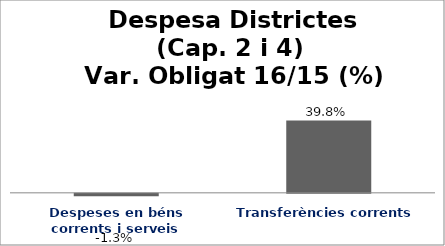
| Category | Series 0 |
|---|---|
| Despeses en béns corrents i serveis | -0.013 |
| Transferències corrents | 0.398 |